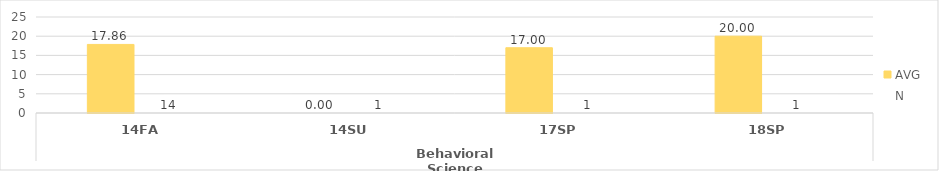
| Category | Oral Communication - AVG | Oral Communication - N |
|---|---|---|
| 0 | 17.857 | 14 |
| 1 | 0 | 1 |
| 2 | 17 | 1 |
| 3 | 20 | 1 |